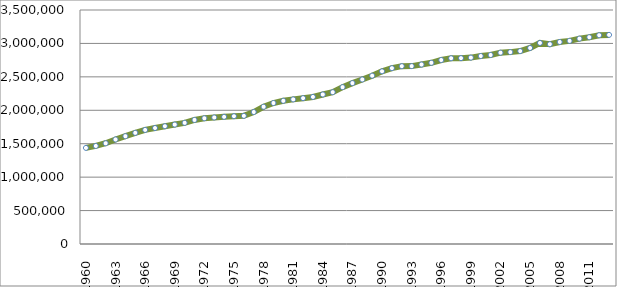
| Category | Series 0 |
|---|---|
| 1960.0 | 1437503.306 |
| 1961.0 | 1466595.086 |
| 1962.0 | 1506769.447 |
| 1963.0 | 1563567.682 |
| 1964.0 | 1612515.755 |
| 1965.0 | 1662387.377 |
| 1966.0 | 1706255.932 |
| 1967.0 | 1734885.937 |
| 1968.0 | 1761668.845 |
| 1969.0 | 1786142.881 |
| 1970.0 | 1812002.24 |
| 1971.0 | 1855409.022 |
| 1972.0 | 1880806.607 |
| 1973.0 | 1892350.964 |
| 1974.0 | 1902048.223 |
| 1975.0 | 1911283.709 |
| 1976.0 | 1916825 |
| 1977.0 | 1973921.5 |
| 1978.0 | 2052228 |
| 1979.0 | 2108598.25 |
| 1980.0 | 2141682.917 |
| 1981.0 | 2162879.667 |
| 1982.0 | 2181451.583 |
| 1983.0 | 2199820.083 |
| 1984.0 | 2236436 |
| 1985.0 | 2270357.75 |
| 1986.0 | 2345899.083 |
| 1987.0 | 2406557.083 |
| 1988.0 | 2460800.917 |
| 1989.0 | 2517422.333 |
| 1990.0 | 2582826.667 |
| 1991.0 | 2629882.583 |
| 1992.0 | 2659658 |
| 1993.0 | 2660794.75 |
| 1994.0 | 2684166.25 |
| 1995.0 | 2709899.25 |
| 1996.0 | 2751738.5 |
| 1997.0 | 2778201.75 |
| 1998.0 | 2780009 |
| 1999.0 | 2787870.667 |
| 2000.0 | 2811656.583 |
| 2001.0 | 2827047 |
| 2002.0 | 2861420.167 |
| 2003.0 | 2870026.333 |
| 2004.0 | 2885240 |
| 2005.0 | 2931946 |
| 2006.0 | 3007264 |
| 2007.0 | 2988436 |
| 2008.0 | 3021716 |
| 2009.0 | 3038182 |
| 2010.0 | 3071745 |
| 2011.0 | 3092754 |
| 2012.0 | 3122629 |
| 2013.0 | 3127676 |